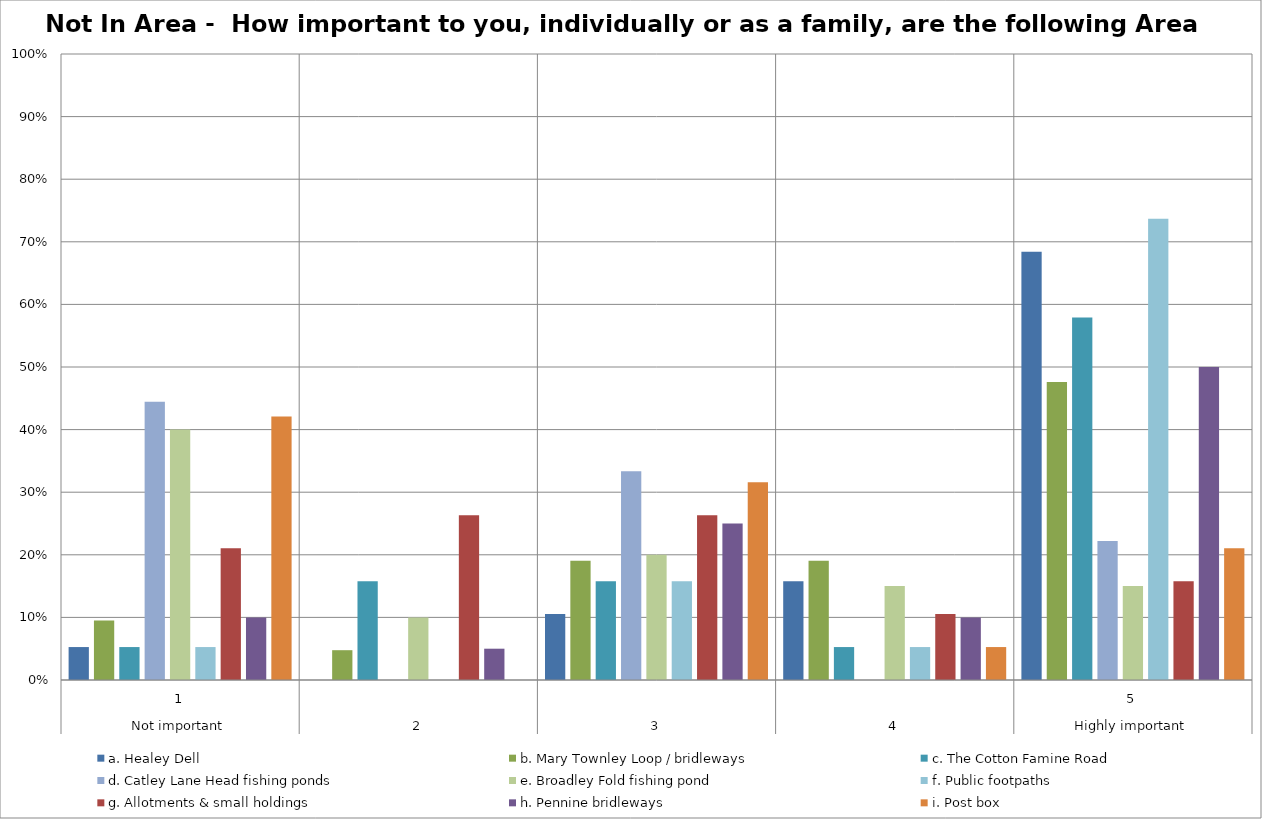
| Category | a. Healey Dell | b. Mary Townley Loop / bridleways | c. The Cotton Famine Road | d. Catley Lane Head fishing ponds | e. Broadley Fold fishing pond | f. Public footpaths | g. Allotments & small holdings | h. Pennine bridleways | i. Post box |
|---|---|---|---|---|---|---|---|---|---|
| 0 | 0.053 | 0.095 | 0.053 | 0.444 | 0.4 | 0.053 | 0.211 | 0.1 | 0.421 |
| 1 | 0 | 0.048 | 0.158 | 0 | 0.1 | 0 | 0.263 | 0.05 | 0 |
| 2 | 0.105 | 0.19 | 0.158 | 0.333 | 0.2 | 0.158 | 0.263 | 0.25 | 0.316 |
| 3 | 0.158 | 0.19 | 0.053 | 0 | 0.15 | 0.053 | 0.105 | 0.1 | 0.053 |
| 4 | 0.684 | 0.476 | 0.579 | 0.222 | 0.15 | 0.737 | 0.158 | 0.5 | 0.211 |